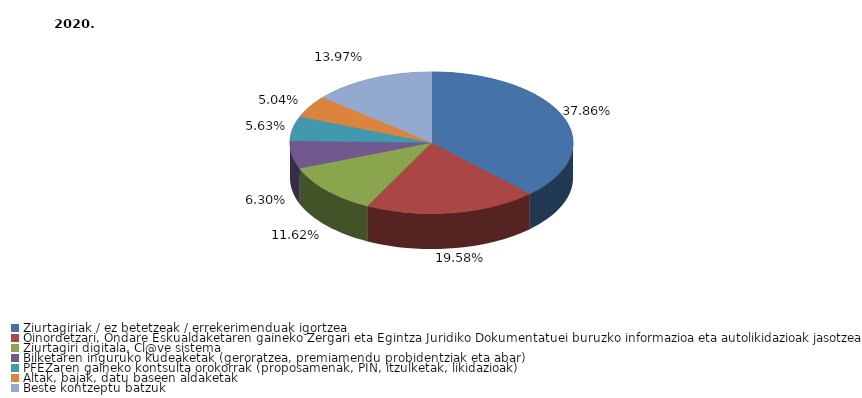
| Category | Series 0 |
|---|---|
| Ziurtagiriak / ez betetzeak / errekerimenduak igortzea | 0.379 |
| Oinordetzari, Ondare Eskualdaketaren gaineko Zergari eta Egintza Juridiko Dokumentatuei buruzko informazioa eta autolikidazioak jasotzea | 0.196 |
| Ziurtagiri digitala, Cl@ve sistema | 0.116 |
| Bilketaren inguruko kudeaketak (geroratzea, premiamendu probidentziak eta abar) | 0.063 |
| PFEZaren gaineko kontsulta orokorrak (proposamenak, PIN, itzulketak, likidazioak) | 0.056 |
| Altak, bajak, datu baseen aldaketak | 0.05 |
| Beste kontzeptu batzuk | 0.14 |